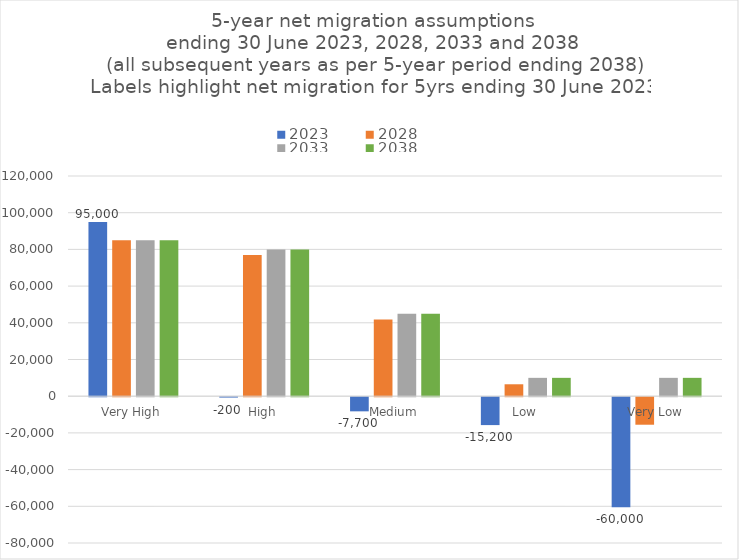
| Category | 2023 | 2028 | 2033 | 2038 |
|---|---|---|---|---|
| Very High | 95000 | 85000 | 85000 | 85000 |
| High | -200 | 77000 | 80000 | 80000 |
| Medium | -7700 | 41750 | 45000 | 45000 |
| Low | -15200 | 6500 | 10000 | 10000 |
| Very Low | -60000 | -15000 | 10000 | 10000 |